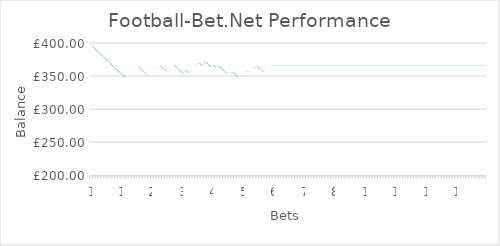
| Category | Bank @ Odds Taken |
|---|---|
| 0 | 396 |
| 1 | 392 |
| 2 | 388 |
| 3 | 384 |
| 4 | 380 |
| 5 | 376 |
| 6 | 372 |
| 7 | 368 |
| 8 | 364 |
| 9 | 360 |
| 10 | 356 |
| 11 | 352 |
| 12 | 348 |
| 13 | 352.788 |
| 14 | 355.258 |
| 15 | 358.488 |
| 16 | 361.148 |
| 17 | 363.808 |
| 18 | 359.808 |
| 19 | 355.808 |
| 20 | 351.808 |
| 21 | 354.848 |
| 22 | 358.268 |
| 23 | 360.89 |
| 24 | 362.41 |
| 25 | 365.298 |
| 26 | 361.298 |
| 27 | 357.298 |
| 28 | 359.958 |
| 29 | 363.036 |
| 30 | 365.886 |
| 31 | 361.886 |
| 32 | 357.886 |
| 33 | 353.886 |
| 34 | 358.598 |
| 35 | 354.598 |
| 36 | 360.108 |
| 37 | 363.414 |
| 38 | 367.214 |
| 39 | 369.418 |
| 40 | 365.418 |
| 41 | 371.802 |
| 42 | 367.802 |
| 43 | 363.802 |
| 44 | 366.196 |
| 45 | 362.196 |
| 46 | 364.78 |
| 47 | 360.78 |
| 48 | 356.78 |
| 49 | 352.78 |
| 50 | 354.604 |
| 51 | 355.744 |
| 52 | 351.744 |
| 53 | 347.744 |
| 54 | 349.872 |
| 55 | 352.342 |
| 56 | 356.142 |
| 57 | 356.142 |
| 58 | 358.84 |
| 59 | 362.906 |
| 60 | 364.312 |
| 61 | 360.312 |
| 62 | 356.312 |
| 63 | 358.592 |
| 64 | 361.48 |
| 65 | 365.698 |
| 66 | 365.698 |
| 67 | 365.698 |
| 68 | 365.698 |
| 69 | 365.698 |
| 70 | 365.698 |
| 71 | 365.698 |
| 72 | 365.698 |
| 73 | 365.698 |
| 74 | 365.698 |
| 75 | 365.698 |
| 76 | 365.698 |
| 77 | 365.698 |
| 78 | 365.698 |
| 79 | 365.698 |
| 80 | 365.698 |
| 81 | 365.698 |
| 82 | 365.698 |
| 83 | 365.698 |
| 84 | 365.698 |
| 85 | 365.698 |
| 86 | 365.698 |
| 87 | 365.698 |
| 88 | 365.698 |
| 89 | 365.698 |
| 90 | 365.698 |
| 91 | 365.698 |
| 92 | 365.698 |
| 93 | 365.698 |
| 94 | 365.698 |
| 95 | 365.698 |
| 96 | 365.698 |
| 97 | 365.698 |
| 98 | 365.698 |
| 99 | 365.698 |
| 100 | 365.698 |
| 101 | 365.698 |
| 102 | 365.698 |
| 103 | 365.698 |
| 104 | 365.698 |
| 105 | 365.698 |
| 106 | 365.698 |
| 107 | 365.698 |
| 108 | 365.698 |
| 109 | 365.698 |
| 110 | 365.698 |
| 111 | 365.698 |
| 112 | 365.698 |
| 113 | 365.698 |
| 114 | 365.698 |
| 115 | 365.698 |
| 116 | 365.698 |
| 117 | 365.698 |
| 118 | 365.698 |
| 119 | 365.698 |
| 120 | 365.698 |
| 121 | 365.698 |
| 122 | 365.698 |
| 123 | 365.698 |
| 124 | 365.698 |
| 125 | 365.698 |
| 126 | 365.698 |
| 127 | 365.698 |
| 128 | 365.698 |
| 129 | 365.698 |
| 130 | 365.698 |
| 131 | 365.698 |
| 132 | 365.698 |
| 133 | 365.698 |
| 134 | 365.698 |
| 135 | 365.698 |
| 136 | 365.698 |
| 137 | 365.698 |
| 138 | 365.698 |
| 139 | 365.698 |
| 140 | 365.698 |
| 141 | 365.698 |
| 142 | 365.698 |